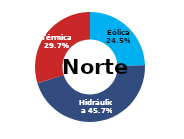
| Category | Norte |
|---|---|
| Eólica | 76.826 |
| Hidráulica | 143.225 |
| Solar | 0 |
| Térmica | 93.151 |